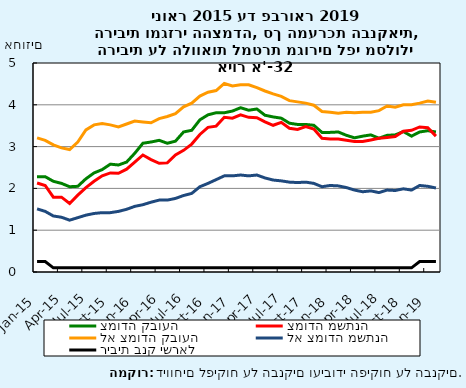
| Category | צמודה קבועה | צמודה משתנה | לא צמודה קבועה | לא צמודה משתנה | ריבית בנק ישראל |
|---|---|---|---|---|---|
| 2015-01-31 | 2.28 | 2.13 | 3.21 | 1.51 | 0.25 |
| 2015-02-28 | 2.28 | 2.07 | 3.15 | 1.45 | 0.25 |
| 2015-03-31 | 2.17 | 1.79 | 3.04 | 1.34 | 0.1 |
| 2015-04-30 | 2.12 | 1.79 | 2.97 | 1.31 | 0.1 |
| 2015-05-31 | 2.04 | 1.64 | 2.93 | 1.24 | 0.1 |
| 2015-06-30 | 2.05 | 1.84 | 3.11 | 1.3 | 0.1 |
| 2015-07-31 | 2.23 | 2.02 | 3.4 | 1.36 | 0.1 |
| 2015-08-31 | 2.37 | 2.17 | 3.52 | 1.4 | 0.1 |
| 2015-09-30 | 2.45 | 2.3 | 3.55 | 1.42 | 0.1 |
| 2015-10-31 | 2.58 | 2.37 | 3.52 | 1.42 | 0.1 |
| 2015-11-30 | 2.56 | 2.36 | 3.47 | 1.45 | 0.1 |
| 2015-12-31 | 2.63 | 2.46 | 3.54 | 1.5 | 0.1 |
| 2016-01-31 | 2.84 | 2.63 | 3.61 | 1.57 | 0.1 |
| 2016-02-29 | 3.08 | 2.8 | 3.59 | 1.61 | 0.1 |
| 2016-03-31 | 3.11 | 2.69 | 3.57 | 1.67 | 0.1 |
| 2016-04-30 | 3.15 | 2.6 | 3.67 | 1.72 | 0.1 |
| 2016-05-31 | 3.08 | 2.61 | 3.72 | 1.72 | 0.1 |
| 2016-06-30 | 3.13 | 2.8 | 3.79 | 1.76 | 0.1 |
| 2016-07-31 | 3.35 | 2.91 | 3.95 | 1.83 | 0.1 |
| 2016-08-31 | 3.39 | 3.06 | 4.04 | 1.88 | 0.1 |
| 2016-09-30 | 3.64 | 3.29 | 4.21 | 2.04 | 0.1 |
| 2016-10-31 | 3.76 | 3.46 | 4.3 | 2.12 | 0.1 |
| 2016-11-30 | 3.81 | 3.49 | 4.34 | 2.21 | 0.1 |
| 2016-12-31 | 3.81 | 3.7 | 4.51 | 2.3 | 0.1 |
| 2017-01-31 | 3.85 | 3.68 | 4.45 | 2.3 | 0.1 |
| 2017-02-28 | 3.93 | 3.76 | 4.48 | 2.32 | 0.1 |
| 2017-03-31 | 3.87 | 3.7 | 4.48 | 2.3 | 0.1 |
| 2017-04-30 | 3.9 | 3.69 | 4.41 | 2.32 | 0.1 |
| 2017-05-31 | 3.75 | 3.59 | 4.33 | 2.25 | 0.1 |
| 2017-06-30 | 3.71 | 3.51 | 4.26 | 2.2 | 0.1 |
| 2017-07-31 | 3.68 | 3.58 | 4.2 | 2.18 | 0.1 |
| 2017-08-31 | 3.56 | 3.44 | 4.1 | 2.15 | 0.1 |
| 2017-09-30 | 3.53 | 3.41 | 4.07 | 2.14 | 0.1 |
| 2017-10-31 | 3.53 | 3.48 | 4.04 | 2.15 | 0.1 |
| 2017-11-30 | 3.51 | 3.42 | 3.99 | 2.12 | 0.1 |
| 2017-12-31 | 3.34 | 3.2 | 3.84 | 2.04 | 0.1 |
| 2018-01-31 | 3.34 | 3.18 | 3.82 | 2.07 | 0.1 |
| 2018-02-28 | 3.35 | 3.18 | 3.8 | 2.06 | 0.1 |
| 2018-03-31 | 3.27 | 3.15 | 3.82 | 2.02 | 0.1 |
| 2018-04-30 | 3.21 | 3.12 | 3.81 | 1.96 | 0.1 |
| 2018-05-31 | 3.25 | 3.12 | 3.82 | 1.92 | 0.1 |
| 2018-06-30 | 3.28 | 3.16 | 3.82 | 1.94 | 0.1 |
| 2018-07-31 | 3.2 | 3.2 | 3.86 | 1.9 | 0.1 |
| 2018-08-31 | 3.27 | 3.22 | 3.97 | 1.96 | 0.1 |
| 2018-09-30 | 3.28 | 3.24 | 3.94 | 1.95 | 0.1 |
| 2018-10-31 | 3.36 | 3.37 | 4 | 1.99 | 0.1 |
| 2018-11-30 | 3.25 | 3.39 | 4 | 1.96 | 0.1 |
| 2018-12-31 | 3.35 | 3.47 | 4.04 | 2.07 | 0.25 |
| 2019-01-31 | 3.38 | 3.45 | 4.09 | 2.05 | 0.25 |
| 2019-02-28 | 3.35 | 3.25 | 4.06 | 2.01 | 0.25 |